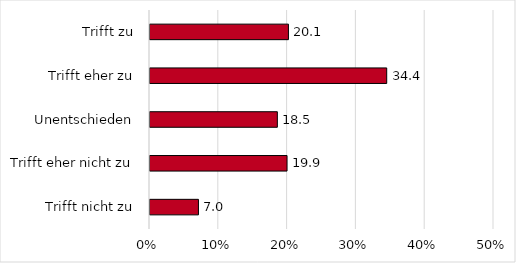
| Category | Series 0 |
|---|---|
| Trifft zu | 20.121 |
| Trifft eher zu | 34.406 |
| Unentschieden | 18.511 |
| Trifft eher nicht zu | 19.92 |
| Trifft nicht zu | 7.042 |